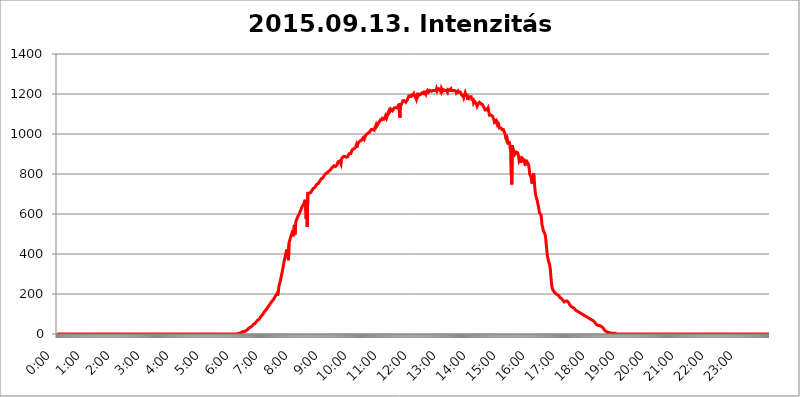
| Category | 2015.09.13. Intenzitás [W/m^2] |
|---|---|
| 0.0 | 0 |
| 0.0006944444444444445 | 0 |
| 0.001388888888888889 | 0 |
| 0.0020833333333333333 | 0 |
| 0.002777777777777778 | 0 |
| 0.003472222222222222 | 0 |
| 0.004166666666666667 | 0 |
| 0.004861111111111111 | 0 |
| 0.005555555555555556 | 0 |
| 0.0062499999999999995 | 0 |
| 0.006944444444444444 | 0 |
| 0.007638888888888889 | 0 |
| 0.008333333333333333 | 0 |
| 0.009027777777777779 | 0 |
| 0.009722222222222222 | 0 |
| 0.010416666666666666 | 0 |
| 0.011111111111111112 | 0 |
| 0.011805555555555555 | 0 |
| 0.012499999999999999 | 0 |
| 0.013194444444444444 | 0 |
| 0.013888888888888888 | 0 |
| 0.014583333333333332 | 0 |
| 0.015277777777777777 | 0 |
| 0.015972222222222224 | 0 |
| 0.016666666666666666 | 0 |
| 0.017361111111111112 | 0 |
| 0.018055555555555557 | 0 |
| 0.01875 | 0 |
| 0.019444444444444445 | 0 |
| 0.02013888888888889 | 0 |
| 0.020833333333333332 | 0 |
| 0.02152777777777778 | 0 |
| 0.022222222222222223 | 0 |
| 0.02291666666666667 | 0 |
| 0.02361111111111111 | 0 |
| 0.024305555555555556 | 0 |
| 0.024999999999999998 | 0 |
| 0.025694444444444447 | 0 |
| 0.02638888888888889 | 0 |
| 0.027083333333333334 | 0 |
| 0.027777777777777776 | 0 |
| 0.02847222222222222 | 0 |
| 0.029166666666666664 | 0 |
| 0.029861111111111113 | 0 |
| 0.030555555555555555 | 0 |
| 0.03125 | 0 |
| 0.03194444444444445 | 0 |
| 0.03263888888888889 | 0 |
| 0.03333333333333333 | 0 |
| 0.034027777777777775 | 0 |
| 0.034722222222222224 | 0 |
| 0.035416666666666666 | 0 |
| 0.036111111111111115 | 0 |
| 0.03680555555555556 | 0 |
| 0.0375 | 0 |
| 0.03819444444444444 | 0 |
| 0.03888888888888889 | 0 |
| 0.03958333333333333 | 0 |
| 0.04027777777777778 | 0 |
| 0.04097222222222222 | 0 |
| 0.041666666666666664 | 0 |
| 0.042361111111111106 | 0 |
| 0.04305555555555556 | 0 |
| 0.043750000000000004 | 0 |
| 0.044444444444444446 | 0 |
| 0.04513888888888889 | 0 |
| 0.04583333333333334 | 0 |
| 0.04652777777777778 | 0 |
| 0.04722222222222222 | 0 |
| 0.04791666666666666 | 0 |
| 0.04861111111111111 | 0 |
| 0.049305555555555554 | 0 |
| 0.049999999999999996 | 0 |
| 0.05069444444444445 | 0 |
| 0.051388888888888894 | 0 |
| 0.052083333333333336 | 0 |
| 0.05277777777777778 | 0 |
| 0.05347222222222222 | 0 |
| 0.05416666666666667 | 0 |
| 0.05486111111111111 | 0 |
| 0.05555555555555555 | 0 |
| 0.05625 | 0 |
| 0.05694444444444444 | 0 |
| 0.057638888888888885 | 0 |
| 0.05833333333333333 | 0 |
| 0.05902777777777778 | 0 |
| 0.059722222222222225 | 0 |
| 0.06041666666666667 | 0 |
| 0.061111111111111116 | 0 |
| 0.06180555555555556 | 0 |
| 0.0625 | 0 |
| 0.06319444444444444 | 0 |
| 0.06388888888888888 | 0 |
| 0.06458333333333334 | 0 |
| 0.06527777777777778 | 0 |
| 0.06597222222222222 | 0 |
| 0.06666666666666667 | 0 |
| 0.06736111111111111 | 0 |
| 0.06805555555555555 | 0 |
| 0.06874999999999999 | 0 |
| 0.06944444444444443 | 0 |
| 0.07013888888888889 | 0 |
| 0.07083333333333333 | 0 |
| 0.07152777777777779 | 0 |
| 0.07222222222222223 | 0 |
| 0.07291666666666667 | 0 |
| 0.07361111111111111 | 0 |
| 0.07430555555555556 | 0 |
| 0.075 | 0 |
| 0.07569444444444444 | 0 |
| 0.0763888888888889 | 0 |
| 0.07708333333333334 | 0 |
| 0.07777777777777778 | 0 |
| 0.07847222222222222 | 0 |
| 0.07916666666666666 | 0 |
| 0.0798611111111111 | 0 |
| 0.08055555555555556 | 0 |
| 0.08125 | 0 |
| 0.08194444444444444 | 0 |
| 0.08263888888888889 | 0 |
| 0.08333333333333333 | 0 |
| 0.08402777777777777 | 0 |
| 0.08472222222222221 | 0 |
| 0.08541666666666665 | 0 |
| 0.08611111111111112 | 0 |
| 0.08680555555555557 | 0 |
| 0.08750000000000001 | 0 |
| 0.08819444444444445 | 0 |
| 0.08888888888888889 | 0 |
| 0.08958333333333333 | 0 |
| 0.09027777777777778 | 0 |
| 0.09097222222222222 | 0 |
| 0.09166666666666667 | 0 |
| 0.09236111111111112 | 0 |
| 0.09305555555555556 | 0 |
| 0.09375 | 0 |
| 0.09444444444444444 | 0 |
| 0.09513888888888888 | 0 |
| 0.09583333333333333 | 0 |
| 0.09652777777777777 | 0 |
| 0.09722222222222222 | 0 |
| 0.09791666666666667 | 0 |
| 0.09861111111111111 | 0 |
| 0.09930555555555555 | 0 |
| 0.09999999999999999 | 0 |
| 0.10069444444444443 | 0 |
| 0.1013888888888889 | 0 |
| 0.10208333333333335 | 0 |
| 0.10277777777777779 | 0 |
| 0.10347222222222223 | 0 |
| 0.10416666666666667 | 0 |
| 0.10486111111111111 | 0 |
| 0.10555555555555556 | 0 |
| 0.10625 | 0 |
| 0.10694444444444444 | 0 |
| 0.1076388888888889 | 0 |
| 0.10833333333333334 | 0 |
| 0.10902777777777778 | 0 |
| 0.10972222222222222 | 0 |
| 0.1111111111111111 | 0 |
| 0.11180555555555556 | 0 |
| 0.11180555555555556 | 0 |
| 0.1125 | 0 |
| 0.11319444444444444 | 0 |
| 0.11388888888888889 | 0 |
| 0.11458333333333333 | 0 |
| 0.11527777777777777 | 0 |
| 0.11597222222222221 | 0 |
| 0.11666666666666665 | 0 |
| 0.1173611111111111 | 0 |
| 0.11805555555555557 | 0 |
| 0.11944444444444445 | 0 |
| 0.12013888888888889 | 0 |
| 0.12083333333333333 | 0 |
| 0.12152777777777778 | 0 |
| 0.12222222222222223 | 0 |
| 0.12291666666666667 | 0 |
| 0.12291666666666667 | 0 |
| 0.12361111111111112 | 0 |
| 0.12430555555555556 | 0 |
| 0.125 | 0 |
| 0.12569444444444444 | 0 |
| 0.12638888888888888 | 0 |
| 0.12708333333333333 | 0 |
| 0.16875 | 0 |
| 0.12847222222222224 | 0 |
| 0.12916666666666668 | 0 |
| 0.12986111111111112 | 0 |
| 0.13055555555555556 | 0 |
| 0.13125 | 0 |
| 0.13194444444444445 | 0 |
| 0.1326388888888889 | 0 |
| 0.13333333333333333 | 0 |
| 0.13402777777777777 | 0 |
| 0.13402777777777777 | 0 |
| 0.13472222222222222 | 0 |
| 0.13541666666666666 | 0 |
| 0.1361111111111111 | 0 |
| 0.13749999999999998 | 0 |
| 0.13819444444444443 | 0 |
| 0.1388888888888889 | 0 |
| 0.13958333333333334 | 0 |
| 0.14027777777777778 | 0 |
| 0.14097222222222222 | 0 |
| 0.14166666666666666 | 0 |
| 0.1423611111111111 | 0 |
| 0.14305555555555557 | 0 |
| 0.14375000000000002 | 0 |
| 0.14444444444444446 | 0 |
| 0.1451388888888889 | 0 |
| 0.1451388888888889 | 0 |
| 0.14652777777777778 | 0 |
| 0.14722222222222223 | 0 |
| 0.14791666666666667 | 0 |
| 0.1486111111111111 | 0 |
| 0.14930555555555555 | 0 |
| 0.15 | 0 |
| 0.15069444444444444 | 0 |
| 0.15138888888888888 | 0 |
| 0.15208333333333332 | 0 |
| 0.15277777777777776 | 0 |
| 0.15347222222222223 | 0 |
| 0.15416666666666667 | 0 |
| 0.15486111111111112 | 0 |
| 0.15555555555555556 | 0 |
| 0.15625 | 0 |
| 0.15694444444444444 | 0 |
| 0.15763888888888888 | 0 |
| 0.15833333333333333 | 0 |
| 0.15902777777777777 | 0 |
| 0.15972222222222224 | 0 |
| 0.16041666666666668 | 0 |
| 0.16111111111111112 | 0 |
| 0.16180555555555556 | 0 |
| 0.1625 | 0 |
| 0.16319444444444445 | 0 |
| 0.1638888888888889 | 0 |
| 0.16458333333333333 | 0 |
| 0.16527777777777777 | 0 |
| 0.16597222222222222 | 0 |
| 0.16666666666666666 | 0 |
| 0.1673611111111111 | 0 |
| 0.16805555555555554 | 0 |
| 0.16874999999999998 | 0 |
| 0.16944444444444443 | 0 |
| 0.17013888888888887 | 0 |
| 0.1708333333333333 | 0 |
| 0.17152777777777775 | 0 |
| 0.17222222222222225 | 0 |
| 0.1729166666666667 | 0 |
| 0.17361111111111113 | 0 |
| 0.17430555555555557 | 0 |
| 0.17500000000000002 | 0 |
| 0.17569444444444446 | 0 |
| 0.1763888888888889 | 0 |
| 0.17708333333333334 | 0 |
| 0.17777777777777778 | 0 |
| 0.17847222222222223 | 0 |
| 0.17916666666666667 | 0 |
| 0.1798611111111111 | 0 |
| 0.18055555555555555 | 0 |
| 0.18125 | 0 |
| 0.18194444444444444 | 0 |
| 0.1826388888888889 | 0 |
| 0.18333333333333335 | 0 |
| 0.1840277777777778 | 0 |
| 0.18472222222222223 | 0 |
| 0.18541666666666667 | 0 |
| 0.18611111111111112 | 0 |
| 0.18680555555555556 | 0 |
| 0.1875 | 0 |
| 0.18819444444444444 | 0 |
| 0.18888888888888888 | 0 |
| 0.18958333333333333 | 0 |
| 0.19027777777777777 | 0 |
| 0.1909722222222222 | 0 |
| 0.19166666666666665 | 0 |
| 0.19236111111111112 | 0 |
| 0.19305555555555554 | 0 |
| 0.19375 | 0 |
| 0.19444444444444445 | 0 |
| 0.1951388888888889 | 0 |
| 0.19583333333333333 | 0 |
| 0.19652777777777777 | 0 |
| 0.19722222222222222 | 0 |
| 0.19791666666666666 | 0 |
| 0.1986111111111111 | 0 |
| 0.19930555555555554 | 0 |
| 0.19999999999999998 | 0 |
| 0.20069444444444443 | 0 |
| 0.20138888888888887 | 0 |
| 0.2020833333333333 | 0 |
| 0.2027777777777778 | 0 |
| 0.2034722222222222 | 0 |
| 0.2041666666666667 | 0 |
| 0.20486111111111113 | 0 |
| 0.20555555555555557 | 0 |
| 0.20625000000000002 | 0 |
| 0.20694444444444446 | 0 |
| 0.2076388888888889 | 0 |
| 0.20833333333333334 | 0 |
| 0.20902777777777778 | 0 |
| 0.20972222222222223 | 0 |
| 0.21041666666666667 | 0 |
| 0.2111111111111111 | 0 |
| 0.21180555555555555 | 0 |
| 0.2125 | 0 |
| 0.21319444444444444 | 0 |
| 0.2138888888888889 | 0 |
| 0.21458333333333335 | 0 |
| 0.2152777777777778 | 0 |
| 0.21597222222222223 | 0 |
| 0.21666666666666667 | 0 |
| 0.21736111111111112 | 0 |
| 0.21805555555555556 | 0 |
| 0.21875 | 0 |
| 0.21944444444444444 | 0 |
| 0.22013888888888888 | 0 |
| 0.22083333333333333 | 0 |
| 0.22152777777777777 | 0 |
| 0.2222222222222222 | 0 |
| 0.22291666666666665 | 0 |
| 0.2236111111111111 | 0 |
| 0.22430555555555556 | 0 |
| 0.225 | 0 |
| 0.22569444444444445 | 0 |
| 0.2263888888888889 | 0 |
| 0.22708333333333333 | 0 |
| 0.22777777777777777 | 0 |
| 0.22847222222222222 | 0 |
| 0.22916666666666666 | 0 |
| 0.2298611111111111 | 0 |
| 0.23055555555555554 | 0 |
| 0.23124999999999998 | 0 |
| 0.23194444444444443 | 0 |
| 0.23263888888888887 | 0 |
| 0.2333333333333333 | 0 |
| 0.2340277777777778 | 0 |
| 0.2347222222222222 | 0 |
| 0.2354166666666667 | 0 |
| 0.23611111111111113 | 0 |
| 0.23680555555555557 | 0 |
| 0.23750000000000002 | 0 |
| 0.23819444444444446 | 0 |
| 0.2388888888888889 | 0 |
| 0.23958333333333334 | 0 |
| 0.24027777777777778 | 0 |
| 0.24097222222222223 | 0 |
| 0.24166666666666667 | 0 |
| 0.2423611111111111 | 0 |
| 0.24305555555555555 | 0 |
| 0.24375 | 0 |
| 0.24444444444444446 | 0 |
| 0.24513888888888888 | 0 |
| 0.24583333333333335 | 0 |
| 0.2465277777777778 | 0 |
| 0.24722222222222223 | 0 |
| 0.24791666666666667 | 0 |
| 0.24861111111111112 | 0 |
| 0.24930555555555556 | 0 |
| 0.25 | 0 |
| 0.25069444444444444 | 0 |
| 0.2513888888888889 | 0 |
| 0.2520833333333333 | 0 |
| 0.25277777777777777 | 3.525 |
| 0.2534722222222222 | 3.525 |
| 0.25416666666666665 | 3.525 |
| 0.2548611111111111 | 3.525 |
| 0.2555555555555556 | 3.525 |
| 0.25625000000000003 | 3.525 |
| 0.2569444444444445 | 3.525 |
| 0.2576388888888889 | 7.887 |
| 0.25833333333333336 | 7.887 |
| 0.2590277777777778 | 7.887 |
| 0.25972222222222224 | 7.887 |
| 0.2604166666666667 | 12.257 |
| 0.2611111111111111 | 12.257 |
| 0.26180555555555557 | 12.257 |
| 0.2625 | 12.257 |
| 0.26319444444444445 | 12.257 |
| 0.2638888888888889 | 16.636 |
| 0.26458333333333334 | 16.636 |
| 0.2652777777777778 | 16.636 |
| 0.2659722222222222 | 21.024 |
| 0.26666666666666666 | 21.024 |
| 0.2673611111111111 | 25.419 |
| 0.26805555555555555 | 25.419 |
| 0.26875 | 29.823 |
| 0.26944444444444443 | 29.823 |
| 0.2701388888888889 | 29.823 |
| 0.2708333333333333 | 34.234 |
| 0.27152777777777776 | 34.234 |
| 0.2722222222222222 | 38.653 |
| 0.27291666666666664 | 38.653 |
| 0.2736111111111111 | 43.079 |
| 0.2743055555555555 | 43.079 |
| 0.27499999999999997 | 47.511 |
| 0.27569444444444446 | 47.511 |
| 0.27638888888888885 | 51.951 |
| 0.27708333333333335 | 51.951 |
| 0.2777777777777778 | 56.398 |
| 0.27847222222222223 | 56.398 |
| 0.2791666666666667 | 60.85 |
| 0.2798611111111111 | 60.85 |
| 0.28055555555555556 | 65.31 |
| 0.28125 | 69.775 |
| 0.28194444444444444 | 74.246 |
| 0.2826388888888889 | 74.246 |
| 0.2833333333333333 | 74.246 |
| 0.28402777777777777 | 78.722 |
| 0.2847222222222222 | 83.205 |
| 0.28541666666666665 | 83.205 |
| 0.28611111111111115 | 87.692 |
| 0.28680555555555554 | 92.184 |
| 0.28750000000000003 | 96.682 |
| 0.2881944444444445 | 96.682 |
| 0.2888888888888889 | 101.184 |
| 0.28958333333333336 | 105.69 |
| 0.2902777777777778 | 110.201 |
| 0.29097222222222224 | 110.201 |
| 0.2916666666666667 | 114.716 |
| 0.2923611111111111 | 119.235 |
| 0.29305555555555557 | 119.235 |
| 0.29375 | 123.758 |
| 0.29444444444444445 | 128.284 |
| 0.2951388888888889 | 132.814 |
| 0.29583333333333334 | 137.347 |
| 0.2965277777777778 | 137.347 |
| 0.2972222222222222 | 141.884 |
| 0.29791666666666666 | 146.423 |
| 0.2986111111111111 | 150.964 |
| 0.29930555555555555 | 155.509 |
| 0.3 | 160.056 |
| 0.30069444444444443 | 160.056 |
| 0.3013888888888889 | 164.605 |
| 0.3020833333333333 | 164.605 |
| 0.30277777777777776 | 169.156 |
| 0.3034722222222222 | 173.709 |
| 0.30416666666666664 | 178.264 |
| 0.3048611111111111 | 182.82 |
| 0.3055555555555555 | 187.378 |
| 0.30624999999999997 | 191.937 |
| 0.3069444444444444 | 191.937 |
| 0.3076388888888889 | 196.497 |
| 0.30833333333333335 | 201.058 |
| 0.3090277777777778 | 191.937 |
| 0.30972222222222223 | 196.497 |
| 0.3104166666666667 | 223.873 |
| 0.3111111111111111 | 242.127 |
| 0.31180555555555556 | 251.251 |
| 0.3125 | 260.373 |
| 0.31319444444444444 | 269.49 |
| 0.3138888888888889 | 283.156 |
| 0.3145833333333333 | 296.808 |
| 0.31527777777777777 | 305.898 |
| 0.3159722222222222 | 319.517 |
| 0.31666666666666665 | 333.113 |
| 0.31736111111111115 | 346.682 |
| 0.31805555555555554 | 360.221 |
| 0.31875000000000003 | 373.729 |
| 0.3194444444444445 | 382.715 |
| 0.3201388888888889 | 396.164 |
| 0.32083333333333336 | 405.108 |
| 0.3215277777777778 | 414.035 |
| 0.32222222222222224 | 422.943 |
| 0.3229166666666667 | 427.39 |
| 0.3236111111111111 | 427.39 |
| 0.32430555555555557 | 369.23 |
| 0.325 | 453.968 |
| 0.32569444444444445 | 462.786 |
| 0.3263888888888889 | 471.582 |
| 0.32708333333333334 | 480.356 |
| 0.3277777777777778 | 489.108 |
| 0.3284722222222222 | 497.836 |
| 0.32916666666666666 | 502.192 |
| 0.3298611111111111 | 510.885 |
| 0.33055555555555555 | 519.555 |
| 0.33125 | 489.108 |
| 0.33194444444444443 | 489.108 |
| 0.3326388888888889 | 545.416 |
| 0.3333333333333333 | 497.836 |
| 0.3340277777777778 | 523.88 |
| 0.3347222222222222 | 562.53 |
| 0.3354166666666667 | 566.793 |
| 0.3361111111111111 | 575.299 |
| 0.3368055555555556 | 579.542 |
| 0.33749999999999997 | 588.009 |
| 0.33819444444444446 | 592.233 |
| 0.33888888888888885 | 596.45 |
| 0.33958333333333335 | 600.661 |
| 0.34027777777777773 | 609.062 |
| 0.34097222222222223 | 613.252 |
| 0.3416666666666666 | 621.613 |
| 0.3423611111111111 | 625.784 |
| 0.3430555555555555 | 634.105 |
| 0.34375 | 638.256 |
| 0.3444444444444445 | 642.4 |
| 0.3451388888888889 | 646.537 |
| 0.3458333333333334 | 650.667 |
| 0.34652777777777777 | 658.909 |
| 0.34722222222222227 | 663.019 |
| 0.34791666666666665 | 671.22 |
| 0.34861111111111115 | 675.311 |
| 0.34930555555555554 | 575.299 |
| 0.35000000000000003 | 658.909 |
| 0.3506944444444444 | 536.82 |
| 0.3513888888888889 | 703.762 |
| 0.3520833333333333 | 699.717 |
| 0.3527777777777778 | 699.717 |
| 0.3534722222222222 | 703.762 |
| 0.3541666666666667 | 703.762 |
| 0.3548611111111111 | 707.8 |
| 0.35555555555555557 | 707.8 |
| 0.35625 | 711.832 |
| 0.35694444444444445 | 715.858 |
| 0.3576388888888889 | 719.877 |
| 0.35833333333333334 | 719.877 |
| 0.3590277777777778 | 727.896 |
| 0.3597222222222222 | 727.896 |
| 0.36041666666666666 | 727.896 |
| 0.3611111111111111 | 731.896 |
| 0.36180555555555555 | 735.89 |
| 0.3625 | 739.877 |
| 0.36319444444444443 | 743.859 |
| 0.3638888888888889 | 747.834 |
| 0.3645833333333333 | 751.803 |
| 0.3652777777777778 | 751.803 |
| 0.3659722222222222 | 751.803 |
| 0.3666666666666667 | 755.766 |
| 0.3673611111111111 | 759.723 |
| 0.3680555555555556 | 763.674 |
| 0.36874999999999997 | 767.62 |
| 0.36944444444444446 | 771.559 |
| 0.37013888888888885 | 775.492 |
| 0.37083333333333335 | 775.492 |
| 0.37152777777777773 | 775.492 |
| 0.37222222222222223 | 779.42 |
| 0.3729166666666666 | 783.342 |
| 0.3736111111111111 | 787.258 |
| 0.3743055555555555 | 791.169 |
| 0.375 | 795.074 |
| 0.3756944444444445 | 798.974 |
| 0.3763888888888889 | 798.974 |
| 0.3770833333333334 | 802.868 |
| 0.37777777777777777 | 802.868 |
| 0.37847222222222227 | 802.868 |
| 0.37916666666666665 | 806.757 |
| 0.37986111111111115 | 810.641 |
| 0.38055555555555554 | 814.519 |
| 0.38125000000000003 | 814.519 |
| 0.3819444444444444 | 814.519 |
| 0.3826388888888889 | 818.392 |
| 0.3833333333333333 | 818.392 |
| 0.3840277777777778 | 826.123 |
| 0.3847222222222222 | 829.981 |
| 0.3854166666666667 | 829.981 |
| 0.3861111111111111 | 833.834 |
| 0.38680555555555557 | 837.682 |
| 0.3875 | 837.682 |
| 0.38819444444444445 | 841.526 |
| 0.3888888888888889 | 845.365 |
| 0.38958333333333334 | 837.682 |
| 0.3902777777777778 | 837.682 |
| 0.3909722222222222 | 837.682 |
| 0.39166666666666666 | 833.834 |
| 0.3923611111111111 | 845.365 |
| 0.39305555555555555 | 849.199 |
| 0.39375 | 860.676 |
| 0.39444444444444443 | 860.676 |
| 0.3951388888888889 | 856.855 |
| 0.3958333333333333 | 864.493 |
| 0.3965277777777778 | 868.305 |
| 0.3972222222222222 | 864.493 |
| 0.3979166666666667 | 849.199 |
| 0.3986111111111111 | 872.114 |
| 0.3993055555555556 | 879.719 |
| 0.39999999999999997 | 883.516 |
| 0.40069444444444446 | 883.516 |
| 0.40138888888888885 | 887.309 |
| 0.40208333333333335 | 887.309 |
| 0.40277777777777773 | 887.309 |
| 0.40347222222222223 | 887.309 |
| 0.4041666666666666 | 887.309 |
| 0.4048611111111111 | 887.309 |
| 0.4055555555555555 | 883.516 |
| 0.40625 | 887.309 |
| 0.4069444444444445 | 887.309 |
| 0.4076388888888889 | 887.309 |
| 0.4083333333333334 | 894.885 |
| 0.40902777777777777 | 894.885 |
| 0.40972222222222227 | 902.447 |
| 0.41041666666666665 | 898.668 |
| 0.41111111111111115 | 902.447 |
| 0.41180555555555554 | 902.447 |
| 0.41250000000000003 | 906.223 |
| 0.4131944444444444 | 917.534 |
| 0.4138888888888889 | 917.534 |
| 0.4145833333333333 | 917.534 |
| 0.4152777777777778 | 925.06 |
| 0.4159722222222222 | 921.298 |
| 0.4166666666666667 | 925.06 |
| 0.4173611111111111 | 928.819 |
| 0.41805555555555557 | 932.576 |
| 0.41875 | 936.33 |
| 0.41944444444444445 | 943.832 |
| 0.4201388888888889 | 932.576 |
| 0.42083333333333334 | 936.33 |
| 0.4215277777777778 | 951.327 |
| 0.4222222222222222 | 951.327 |
| 0.42291666666666666 | 958.814 |
| 0.4236111111111111 | 962.555 |
| 0.42430555555555555 | 962.555 |
| 0.425 | 966.295 |
| 0.42569444444444443 | 970.034 |
| 0.4263888888888889 | 970.034 |
| 0.4270833333333333 | 970.034 |
| 0.4277777777777778 | 966.295 |
| 0.4284722222222222 | 966.295 |
| 0.4291666666666667 | 981.244 |
| 0.4298611111111111 | 981.244 |
| 0.4305555555555556 | 973.772 |
| 0.43124999999999997 | 981.244 |
| 0.43194444444444446 | 988.714 |
| 0.43263888888888885 | 992.448 |
| 0.43333333333333335 | 996.182 |
| 0.43402777777777773 | 999.916 |
| 0.43472222222222223 | 999.916 |
| 0.4354166666666666 | 1003.65 |
| 0.4361111111111111 | 1003.65 |
| 0.4368055555555555 | 1007.383 |
| 0.4375 | 1007.383 |
| 0.4381944444444445 | 1007.383 |
| 0.4388888888888889 | 1014.852 |
| 0.4395833333333334 | 1014.852 |
| 0.44027777777777777 | 1022.323 |
| 0.44097222222222227 | 1022.323 |
| 0.44166666666666665 | 1018.587 |
| 0.44236111111111115 | 1022.323 |
| 0.44305555555555554 | 1026.06 |
| 0.44375000000000003 | 1022.323 |
| 0.4444444444444444 | 1018.587 |
| 0.4451388888888889 | 1029.798 |
| 0.4458333333333333 | 1029.798 |
| 0.4465277777777778 | 1037.277 |
| 0.4472222222222222 | 1044.762 |
| 0.4479166666666667 | 1037.277 |
| 0.4486111111111111 | 1041.019 |
| 0.44930555555555557 | 1044.762 |
| 0.45 | 1052.255 |
| 0.45069444444444445 | 1056.004 |
| 0.4513888888888889 | 1059.756 |
| 0.45208333333333334 | 1063.51 |
| 0.4527777777777778 | 1063.51 |
| 0.4534722222222222 | 1071.027 |
| 0.45416666666666666 | 1067.267 |
| 0.4548611111111111 | 1067.267 |
| 0.45555555555555555 | 1071.027 |
| 0.45625 | 1078.555 |
| 0.45694444444444443 | 1078.555 |
| 0.4576388888888889 | 1074.789 |
| 0.4583333333333333 | 1074.789 |
| 0.4590277777777778 | 1074.789 |
| 0.4597222222222222 | 1082.324 |
| 0.4604166666666667 | 1089.873 |
| 0.4611111111111111 | 1093.653 |
| 0.4618055555555556 | 1078.555 |
| 0.46249999999999997 | 1086.097 |
| 0.46319444444444446 | 1097.437 |
| 0.46388888888888885 | 1105.019 |
| 0.46458333333333335 | 1105.019 |
| 0.46527777777777773 | 1116.426 |
| 0.46597222222222223 | 1108.816 |
| 0.4666666666666666 | 1112.618 |
| 0.4673611111111111 | 1116.426 |
| 0.4680555555555555 | 1124.056 |
| 0.46875 | 1120.238 |
| 0.4694444444444445 | 1120.238 |
| 0.4701388888888889 | 1116.426 |
| 0.4708333333333334 | 1116.426 |
| 0.47152777777777777 | 1124.056 |
| 0.47222222222222227 | 1120.238 |
| 0.47291666666666665 | 1131.708 |
| 0.47361111111111115 | 1127.879 |
| 0.47430555555555554 | 1135.543 |
| 0.47500000000000003 | 1131.708 |
| 0.4756944444444444 | 1131.708 |
| 0.4763888888888889 | 1127.879 |
| 0.4770833333333333 | 1131.708 |
| 0.4777777777777778 | 1135.543 |
| 0.4784722222222222 | 1143.232 |
| 0.4791666666666667 | 1150.946 |
| 0.4798611111111111 | 1147.086 |
| 0.48055555555555557 | 1082.324 |
| 0.48125 | 1154.814 |
| 0.48194444444444445 | 1143.232 |
| 0.4826388888888889 | 1143.232 |
| 0.48333333333333334 | 1147.086 |
| 0.4840277777777778 | 1158.689 |
| 0.4847222222222222 | 1166.46 |
| 0.48541666666666666 | 1162.571 |
| 0.4861111111111111 | 1166.46 |
| 0.48680555555555555 | 1166.46 |
| 0.4875 | 1162.571 |
| 0.48819444444444443 | 1162.571 |
| 0.4888888888888889 | 1158.689 |
| 0.4895833333333333 | 1162.571 |
| 0.4902777777777778 | 1162.571 |
| 0.4909722222222222 | 1170.358 |
| 0.4916666666666667 | 1170.358 |
| 0.4923611111111111 | 1174.263 |
| 0.4930555555555556 | 1189.969 |
| 0.49374999999999997 | 1186.03 |
| 0.49444444444444446 | 1186.03 |
| 0.49513888888888885 | 1189.969 |
| 0.49583333333333335 | 1182.099 |
| 0.49652777777777773 | 1193.918 |
| 0.49722222222222223 | 1197.876 |
| 0.4979166666666666 | 1193.918 |
| 0.4986111111111111 | 1193.918 |
| 0.4993055555555555 | 1193.918 |
| 0.5 | 1201.843 |
| 0.5006944444444444 | 1193.918 |
| 0.5013888888888889 | 1197.876 |
| 0.5020833333333333 | 1186.03 |
| 0.5027777777777778 | 1186.03 |
| 0.5034722222222222 | 1174.263 |
| 0.5041666666666667 | 1189.969 |
| 0.5048611111111111 | 1197.876 |
| 0.5055555555555555 | 1205.82 |
| 0.50625 | 1189.969 |
| 0.5069444444444444 | 1193.918 |
| 0.5076388888888889 | 1197.876 |
| 0.5083333333333333 | 1201.843 |
| 0.5090277777777777 | 1201.843 |
| 0.5097222222222222 | 1197.876 |
| 0.5104166666666666 | 1201.843 |
| 0.5111111111111112 | 1201.843 |
| 0.5118055555555555 | 1205.82 |
| 0.5125000000000001 | 1205.82 |
| 0.5131944444444444 | 1209.807 |
| 0.513888888888889 | 1201.843 |
| 0.5145833333333333 | 1209.807 |
| 0.5152777777777778 | 1205.82 |
| 0.5159722222222222 | 1205.82 |
| 0.5166666666666667 | 1209.807 |
| 0.517361111111111 | 1201.843 |
| 0.5180555555555556 | 1209.807 |
| 0.5187499999999999 | 1213.804 |
| 0.5194444444444445 | 1217.812 |
| 0.5201388888888888 | 1213.804 |
| 0.5208333333333334 | 1209.807 |
| 0.5215277777777778 | 1213.804 |
| 0.5222222222222223 | 1213.804 |
| 0.5229166666666667 | 1217.812 |
| 0.5236111111111111 | 1221.83 |
| 0.5243055555555556 | 1217.812 |
| 0.525 | 1213.804 |
| 0.5256944444444445 | 1217.812 |
| 0.5263888888888889 | 1217.812 |
| 0.5270833333333333 | 1217.812 |
| 0.5277777777777778 | 1221.83 |
| 0.5284722222222222 | 1221.83 |
| 0.5291666666666667 | 1217.812 |
| 0.5298611111111111 | 1221.83 |
| 0.5305555555555556 | 1213.804 |
| 0.53125 | 1217.812 |
| 0.5319444444444444 | 1225.859 |
| 0.5326388888888889 | 1217.812 |
| 0.5333333333333333 | 1225.859 |
| 0.5340277777777778 | 1225.859 |
| 0.5347222222222222 | 1229.899 |
| 0.5354166666666667 | 1225.859 |
| 0.5361111111111111 | 1221.83 |
| 0.5368055555555555 | 1217.812 |
| 0.5375 | 1213.804 |
| 0.5381944444444444 | 1209.807 |
| 0.5388888888888889 | 1225.859 |
| 0.5395833333333333 | 1221.83 |
| 0.5402777777777777 | 1213.804 |
| 0.5409722222222222 | 1213.804 |
| 0.5416666666666666 | 1221.83 |
| 0.5423611111111112 | 1217.812 |
| 0.5430555555555555 | 1225.859 |
| 0.5437500000000001 | 1217.812 |
| 0.5444444444444444 | 1217.812 |
| 0.545138888888889 | 1217.812 |
| 0.5458333333333333 | 1217.812 |
| 0.5465277777777778 | 1213.804 |
| 0.5472222222222222 | 1209.807 |
| 0.5479166666666667 | 1221.83 |
| 0.548611111111111 | 1225.859 |
| 0.5493055555555556 | 1217.812 |
| 0.5499999999999999 | 1217.812 |
| 0.5506944444444445 | 1217.812 |
| 0.5513888888888888 | 1221.83 |
| 0.5520833333333334 | 1225.859 |
| 0.5527777777777778 | 1217.812 |
| 0.5534722222222223 | 1217.812 |
| 0.5541666666666667 | 1217.812 |
| 0.5548611111111111 | 1217.812 |
| 0.5555555555555556 | 1213.804 |
| 0.55625 | 1217.812 |
| 0.5569444444444445 | 1217.812 |
| 0.5576388888888889 | 1221.83 |
| 0.5583333333333333 | 1217.812 |
| 0.5590277777777778 | 1213.804 |
| 0.5597222222222222 | 1205.82 |
| 0.5604166666666667 | 1209.807 |
| 0.5611111111111111 | 1201.843 |
| 0.5618055555555556 | 1213.804 |
| 0.5625 | 1201.843 |
| 0.5631944444444444 | 1209.807 |
| 0.5638888888888889 | 1213.804 |
| 0.5645833333333333 | 1213.804 |
| 0.5652777777777778 | 1209.807 |
| 0.5659722222222222 | 1213.804 |
| 0.5666666666666667 | 1213.804 |
| 0.5673611111111111 | 1193.918 |
| 0.5680555555555555 | 1189.969 |
| 0.56875 | 1193.918 |
| 0.5694444444444444 | 1189.969 |
| 0.5701388888888889 | 1182.099 |
| 0.5708333333333333 | 1189.969 |
| 0.5715277777777777 | 1197.876 |
| 0.5722222222222222 | 1205.82 |
| 0.5729166666666666 | 1197.876 |
| 0.5736111111111112 | 1201.843 |
| 0.5743055555555555 | 1193.918 |
| 0.5750000000000001 | 1193.918 |
| 0.5756944444444444 | 1170.358 |
| 0.576388888888889 | 1178.177 |
| 0.5770833333333333 | 1174.263 |
| 0.5777777777777778 | 1178.177 |
| 0.5784722222222222 | 1186.03 |
| 0.5791666666666667 | 1186.03 |
| 0.579861111111111 | 1189.969 |
| 0.5805555555555556 | 1186.03 |
| 0.5812499999999999 | 1174.263 |
| 0.5819444444444445 | 1178.177 |
| 0.5826388888888888 | 1178.177 |
| 0.5833333333333334 | 1174.263 |
| 0.5840277777777778 | 1154.814 |
| 0.5847222222222223 | 1158.689 |
| 0.5854166666666667 | 1162.571 |
| 0.5861111111111111 | 1158.689 |
| 0.5868055555555556 | 1162.571 |
| 0.5875 | 1154.814 |
| 0.5881944444444445 | 1154.814 |
| 0.5888888888888889 | 1139.384 |
| 0.5895833333333333 | 1143.232 |
| 0.5902777777777778 | 1150.946 |
| 0.5909722222222222 | 1150.946 |
| 0.5916666666666667 | 1150.946 |
| 0.5923611111111111 | 1158.689 |
| 0.5930555555555556 | 1162.571 |
| 0.59375 | 1158.689 |
| 0.5944444444444444 | 1150.946 |
| 0.5951388888888889 | 1150.946 |
| 0.5958333333333333 | 1154.814 |
| 0.5965277777777778 | 1147.086 |
| 0.5972222222222222 | 1143.232 |
| 0.5979166666666667 | 1135.543 |
| 0.5986111111111111 | 1131.708 |
| 0.5993055555555555 | 1127.879 |
| 0.6 | 1120.238 |
| 0.6006944444444444 | 1116.426 |
| 0.6013888888888889 | 1120.238 |
| 0.6020833333333333 | 1120.238 |
| 0.6027777777777777 | 1124.056 |
| 0.6034722222222222 | 1120.238 |
| 0.6041666666666666 | 1131.708 |
| 0.6048611111111112 | 1120.238 |
| 0.6055555555555555 | 1116.426 |
| 0.6062500000000001 | 1093.653 |
| 0.6069444444444444 | 1093.653 |
| 0.607638888888889 | 1093.653 |
| 0.6083333333333333 | 1093.653 |
| 0.6090277777777778 | 1093.653 |
| 0.6097222222222222 | 1097.437 |
| 0.6104166666666667 | 1089.873 |
| 0.611111111111111 | 1089.873 |
| 0.6118055555555556 | 1086.097 |
| 0.6124999999999999 | 1071.027 |
| 0.6131944444444445 | 1059.756 |
| 0.6138888888888888 | 1059.756 |
| 0.6145833333333334 | 1059.756 |
| 0.6152777777777778 | 1067.267 |
| 0.6159722222222223 | 1059.756 |
| 0.6166666666666667 | 1052.255 |
| 0.6173611111111111 | 1059.756 |
| 0.6180555555555556 | 1056.004 |
| 0.61875 | 1052.255 |
| 0.6194444444444445 | 1041.019 |
| 0.6201388888888889 | 1029.798 |
| 0.6208333333333333 | 1033.537 |
| 0.6215277777777778 | 1033.537 |
| 0.6222222222222222 | 1029.798 |
| 0.6229166666666667 | 1026.06 |
| 0.6236111111111111 | 1022.323 |
| 0.6243055555555556 | 1018.587 |
| 0.625 | 1022.323 |
| 0.6256944444444444 | 1022.323 |
| 0.6263888888888889 | 1014.852 |
| 0.6270833333333333 | 1014.852 |
| 0.6277777777777778 | 1003.65 |
| 0.6284722222222222 | 992.448 |
| 0.6291666666666667 | 977.508 |
| 0.6298611111111111 | 977.508 |
| 0.6305555555555555 | 966.295 |
| 0.63125 | 973.772 |
| 0.6319444444444444 | 962.555 |
| 0.6326388888888889 | 947.58 |
| 0.6333333333333333 | 962.555 |
| 0.6340277777777777 | 955.071 |
| 0.6347222222222222 | 947.58 |
| 0.6354166666666666 | 925.06 |
| 0.6361111111111112 | 943.832 |
| 0.6368055555555555 | 802.868 |
| 0.6375000000000001 | 747.834 |
| 0.6381944444444444 | 943.832 |
| 0.638888888888889 | 932.576 |
| 0.6395833333333333 | 928.819 |
| 0.6402777777777778 | 913.766 |
| 0.6409722222222222 | 909.996 |
| 0.6416666666666667 | 898.668 |
| 0.642361111111111 | 894.885 |
| 0.6430555555555556 | 902.447 |
| 0.6437499999999999 | 909.996 |
| 0.6444444444444445 | 906.223 |
| 0.6451388888888888 | 909.996 |
| 0.6458333333333334 | 906.223 |
| 0.6465277777777778 | 894.885 |
| 0.6472222222222223 | 887.309 |
| 0.6479166666666667 | 864.493 |
| 0.6486111111111111 | 868.305 |
| 0.6493055555555556 | 872.114 |
| 0.65 | 856.855 |
| 0.6506944444444445 | 868.305 |
| 0.6513888888888889 | 872.114 |
| 0.6520833333333333 | 879.719 |
| 0.6527777777777778 | 883.516 |
| 0.6534722222222222 | 883.516 |
| 0.6541666666666667 | 872.114 |
| 0.6548611111111111 | 860.676 |
| 0.6555555555555556 | 853.029 |
| 0.65625 | 853.029 |
| 0.6569444444444444 | 860.676 |
| 0.6576388888888889 | 853.029 |
| 0.6583333333333333 | 853.029 |
| 0.6590277777777778 | 860.676 |
| 0.6597222222222222 | 860.676 |
| 0.6604166666666667 | 853.029 |
| 0.6611111111111111 | 845.365 |
| 0.6618055555555555 | 829.981 |
| 0.6625 | 802.868 |
| 0.6631944444444444 | 795.074 |
| 0.6638888888888889 | 791.169 |
| 0.6645833333333333 | 783.342 |
| 0.6652777777777777 | 771.559 |
| 0.6659722222222222 | 751.803 |
| 0.6666666666666666 | 763.674 |
| 0.6673611111111111 | 759.723 |
| 0.6680555555555556 | 802.868 |
| 0.6687500000000001 | 783.342 |
| 0.6694444444444444 | 747.834 |
| 0.6701388888888888 | 719.877 |
| 0.6708333333333334 | 695.666 |
| 0.6715277777777778 | 699.717 |
| 0.6722222222222222 | 691.608 |
| 0.6729166666666666 | 671.22 |
| 0.6736111111111112 | 658.909 |
| 0.6743055555555556 | 646.537 |
| 0.6749999999999999 | 634.105 |
| 0.6756944444444444 | 621.613 |
| 0.6763888888888889 | 604.864 |
| 0.6770833333333334 | 609.062 |
| 0.6777777777777777 | 600.661 |
| 0.6784722222222223 | 596.45 |
| 0.6791666666666667 | 575.299 |
| 0.6798611111111111 | 545.416 |
| 0.6805555555555555 | 536.82 |
| 0.68125 | 532.513 |
| 0.6819444444444445 | 515.223 |
| 0.6826388888888889 | 510.885 |
| 0.6833333333333332 | 506.542 |
| 0.6840277777777778 | 497.836 |
| 0.6847222222222222 | 489.108 |
| 0.6854166666666667 | 462.786 |
| 0.686111111111111 | 436.27 |
| 0.6868055555555556 | 414.035 |
| 0.6875 | 387.202 |
| 0.6881944444444444 | 378.224 |
| 0.688888888888889 | 364.728 |
| 0.6895833333333333 | 360.221 |
| 0.6902777777777778 | 351.198 |
| 0.6909722222222222 | 337.639 |
| 0.6916666666666668 | 319.517 |
| 0.6923611111111111 | 287.709 |
| 0.6930555555555555 | 260.373 |
| 0.69375 | 237.564 |
| 0.6944444444444445 | 228.436 |
| 0.6951388888888889 | 219.309 |
| 0.6958333333333333 | 219.309 |
| 0.6965277777777777 | 214.746 |
| 0.6972222222222223 | 210.182 |
| 0.6979166666666666 | 210.182 |
| 0.6986111111111111 | 205.62 |
| 0.6993055555555556 | 201.058 |
| 0.7000000000000001 | 201.058 |
| 0.7006944444444444 | 201.058 |
| 0.7013888888888888 | 196.497 |
| 0.7020833333333334 | 196.497 |
| 0.7027777777777778 | 191.937 |
| 0.7034722222222222 | 191.937 |
| 0.7041666666666666 | 187.378 |
| 0.7048611111111112 | 182.82 |
| 0.7055555555555556 | 182.82 |
| 0.7062499999999999 | 182.82 |
| 0.7069444444444444 | 178.264 |
| 0.7076388888888889 | 178.264 |
| 0.7083333333333334 | 173.709 |
| 0.7090277777777777 | 169.156 |
| 0.7097222222222223 | 164.605 |
| 0.7104166666666667 | 164.605 |
| 0.7111111111111111 | 160.056 |
| 0.7118055555555555 | 164.605 |
| 0.7125 | 164.605 |
| 0.7131944444444445 | 164.605 |
| 0.7138888888888889 | 164.605 |
| 0.7145833333333332 | 164.605 |
| 0.7152777777777778 | 164.605 |
| 0.7159722222222222 | 160.056 |
| 0.7166666666666667 | 160.056 |
| 0.717361111111111 | 155.509 |
| 0.7180555555555556 | 150.964 |
| 0.71875 | 146.423 |
| 0.7194444444444444 | 141.884 |
| 0.720138888888889 | 141.884 |
| 0.7208333333333333 | 137.347 |
| 0.7215277777777778 | 137.347 |
| 0.7222222222222222 | 137.347 |
| 0.7229166666666668 | 132.814 |
| 0.7236111111111111 | 132.814 |
| 0.7243055555555555 | 128.284 |
| 0.725 | 128.284 |
| 0.7256944444444445 | 128.284 |
| 0.7263888888888889 | 123.758 |
| 0.7270833333333333 | 119.235 |
| 0.7277777777777777 | 119.235 |
| 0.7284722222222223 | 119.235 |
| 0.7291666666666666 | 114.716 |
| 0.7298611111111111 | 114.716 |
| 0.7305555555555556 | 110.201 |
| 0.7312500000000001 | 110.201 |
| 0.7319444444444444 | 110.201 |
| 0.7326388888888888 | 105.69 |
| 0.7333333333333334 | 105.69 |
| 0.7340277777777778 | 105.69 |
| 0.7347222222222222 | 101.184 |
| 0.7354166666666666 | 101.184 |
| 0.7361111111111112 | 101.184 |
| 0.7368055555555556 | 101.184 |
| 0.7374999999999999 | 96.682 |
| 0.7381944444444444 | 96.682 |
| 0.7388888888888889 | 96.682 |
| 0.7395833333333334 | 92.184 |
| 0.7402777777777777 | 92.184 |
| 0.7409722222222223 | 92.184 |
| 0.7416666666666667 | 87.692 |
| 0.7423611111111111 | 87.692 |
| 0.7430555555555555 | 87.692 |
| 0.74375 | 83.205 |
| 0.7444444444444445 | 83.205 |
| 0.7451388888888889 | 83.205 |
| 0.7458333333333332 | 78.722 |
| 0.7465277777777778 | 78.722 |
| 0.7472222222222222 | 74.246 |
| 0.7479166666666667 | 74.246 |
| 0.748611111111111 | 69.775 |
| 0.7493055555555556 | 69.775 |
| 0.75 | 69.775 |
| 0.7506944444444444 | 65.31 |
| 0.751388888888889 | 65.31 |
| 0.7520833333333333 | 65.31 |
| 0.7527777777777778 | 60.85 |
| 0.7534722222222222 | 60.85 |
| 0.7541666666666668 | 56.398 |
| 0.7548611111111111 | 56.398 |
| 0.7555555555555555 | 51.951 |
| 0.75625 | 47.511 |
| 0.7569444444444445 | 43.079 |
| 0.7576388888888889 | 43.079 |
| 0.7583333333333333 | 43.079 |
| 0.7590277777777777 | 43.079 |
| 0.7597222222222223 | 43.079 |
| 0.7604166666666666 | 43.079 |
| 0.7611111111111111 | 38.653 |
| 0.7618055555555556 | 38.653 |
| 0.7625000000000001 | 38.653 |
| 0.7631944444444444 | 38.653 |
| 0.7638888888888888 | 34.234 |
| 0.7645833333333334 | 34.234 |
| 0.7652777777777778 | 29.823 |
| 0.7659722222222222 | 29.823 |
| 0.7666666666666666 | 25.419 |
| 0.7673611111111112 | 21.024 |
| 0.7680555555555556 | 16.636 |
| 0.7687499999999999 | 16.636 |
| 0.7694444444444444 | 12.257 |
| 0.7701388888888889 | 12.257 |
| 0.7708333333333334 | 12.257 |
| 0.7715277777777777 | 12.257 |
| 0.7722222222222223 | 7.887 |
| 0.7729166666666667 | 7.887 |
| 0.7736111111111111 | 7.887 |
| 0.7743055555555555 | 7.887 |
| 0.775 | 7.887 |
| 0.7756944444444445 | 7.887 |
| 0.7763888888888889 | 3.525 |
| 0.7770833333333332 | 3.525 |
| 0.7777777777777778 | 3.525 |
| 0.7784722222222222 | 3.525 |
| 0.7791666666666667 | 3.525 |
| 0.779861111111111 | 3.525 |
| 0.7805555555555556 | 3.525 |
| 0.78125 | 3.525 |
| 0.7819444444444444 | 3.525 |
| 0.782638888888889 | 3.525 |
| 0.7833333333333333 | 0 |
| 0.7840277777777778 | 0 |
| 0.7847222222222222 | 0 |
| 0.7854166666666668 | 0 |
| 0.7861111111111111 | 0 |
| 0.7868055555555555 | 0 |
| 0.7875 | 0 |
| 0.7881944444444445 | 0 |
| 0.7888888888888889 | 0 |
| 0.7895833333333333 | 0 |
| 0.7902777777777777 | 0 |
| 0.7909722222222223 | 0 |
| 0.7916666666666666 | 0 |
| 0.7923611111111111 | 0 |
| 0.7930555555555556 | 0 |
| 0.7937500000000001 | 0 |
| 0.7944444444444444 | 0 |
| 0.7951388888888888 | 0 |
| 0.7958333333333334 | 0 |
| 0.7965277777777778 | 0 |
| 0.7972222222222222 | 0 |
| 0.7979166666666666 | 0 |
| 0.7986111111111112 | 0 |
| 0.7993055555555556 | 0 |
| 0.7999999999999999 | 0 |
| 0.8006944444444444 | 0 |
| 0.8013888888888889 | 0 |
| 0.8020833333333334 | 0 |
| 0.8027777777777777 | 0 |
| 0.8034722222222223 | 0 |
| 0.8041666666666667 | 0 |
| 0.8048611111111111 | 0 |
| 0.8055555555555555 | 0 |
| 0.80625 | 0 |
| 0.8069444444444445 | 0 |
| 0.8076388888888889 | 0 |
| 0.8083333333333332 | 0 |
| 0.8090277777777778 | 0 |
| 0.8097222222222222 | 0 |
| 0.8104166666666667 | 0 |
| 0.811111111111111 | 0 |
| 0.8118055555555556 | 0 |
| 0.8125 | 0 |
| 0.8131944444444444 | 0 |
| 0.813888888888889 | 0 |
| 0.8145833333333333 | 0 |
| 0.8152777777777778 | 0 |
| 0.8159722222222222 | 0 |
| 0.8166666666666668 | 0 |
| 0.8173611111111111 | 0 |
| 0.8180555555555555 | 0 |
| 0.81875 | 0 |
| 0.8194444444444445 | 0 |
| 0.8201388888888889 | 0 |
| 0.8208333333333333 | 0 |
| 0.8215277777777777 | 0 |
| 0.8222222222222223 | 0 |
| 0.8229166666666666 | 0 |
| 0.8236111111111111 | 0 |
| 0.8243055555555556 | 0 |
| 0.8250000000000001 | 0 |
| 0.8256944444444444 | 0 |
| 0.8263888888888888 | 0 |
| 0.8270833333333334 | 0 |
| 0.8277777777777778 | 0 |
| 0.8284722222222222 | 0 |
| 0.8291666666666666 | 0 |
| 0.8298611111111112 | 0 |
| 0.8305555555555556 | 0 |
| 0.8312499999999999 | 0 |
| 0.8319444444444444 | 0 |
| 0.8326388888888889 | 0 |
| 0.8333333333333334 | 0 |
| 0.8340277777777777 | 0 |
| 0.8347222222222223 | 0 |
| 0.8354166666666667 | 0 |
| 0.8361111111111111 | 0 |
| 0.8368055555555555 | 0 |
| 0.8375 | 0 |
| 0.8381944444444445 | 0 |
| 0.8388888888888889 | 0 |
| 0.8395833333333332 | 0 |
| 0.8402777777777778 | 0 |
| 0.8409722222222222 | 0 |
| 0.8416666666666667 | 0 |
| 0.842361111111111 | 0 |
| 0.8430555555555556 | 0 |
| 0.84375 | 0 |
| 0.8444444444444444 | 0 |
| 0.845138888888889 | 0 |
| 0.8458333333333333 | 0 |
| 0.8465277777777778 | 0 |
| 0.8472222222222222 | 0 |
| 0.8479166666666668 | 0 |
| 0.8486111111111111 | 0 |
| 0.8493055555555555 | 0 |
| 0.85 | 0 |
| 0.8506944444444445 | 0 |
| 0.8513888888888889 | 0 |
| 0.8520833333333333 | 0 |
| 0.8527777777777777 | 0 |
| 0.8534722222222223 | 0 |
| 0.8541666666666666 | 0 |
| 0.8548611111111111 | 0 |
| 0.8555555555555556 | 0 |
| 0.8562500000000001 | 0 |
| 0.8569444444444444 | 0 |
| 0.8576388888888888 | 0 |
| 0.8583333333333334 | 0 |
| 0.8590277777777778 | 0 |
| 0.8597222222222222 | 0 |
| 0.8604166666666666 | 0 |
| 0.8611111111111112 | 0 |
| 0.8618055555555556 | 0 |
| 0.8624999999999999 | 0 |
| 0.8631944444444444 | 0 |
| 0.8638888888888889 | 0 |
| 0.8645833333333334 | 0 |
| 0.8652777777777777 | 0 |
| 0.8659722222222223 | 0 |
| 0.8666666666666667 | 0 |
| 0.8673611111111111 | 0 |
| 0.8680555555555555 | 0 |
| 0.86875 | 0 |
| 0.8694444444444445 | 0 |
| 0.8701388888888889 | 0 |
| 0.8708333333333332 | 0 |
| 0.8715277777777778 | 0 |
| 0.8722222222222222 | 0 |
| 0.8729166666666667 | 0 |
| 0.873611111111111 | 0 |
| 0.8743055555555556 | 0 |
| 0.875 | 0 |
| 0.8756944444444444 | 0 |
| 0.876388888888889 | 0 |
| 0.8770833333333333 | 0 |
| 0.8777777777777778 | 0 |
| 0.8784722222222222 | 0 |
| 0.8791666666666668 | 0 |
| 0.8798611111111111 | 0 |
| 0.8805555555555555 | 0 |
| 0.88125 | 0 |
| 0.8819444444444445 | 0 |
| 0.8826388888888889 | 0 |
| 0.8833333333333333 | 0 |
| 0.8840277777777777 | 0 |
| 0.8847222222222223 | 0 |
| 0.8854166666666666 | 0 |
| 0.8861111111111111 | 0 |
| 0.8868055555555556 | 0 |
| 0.8875000000000001 | 0 |
| 0.8881944444444444 | 0 |
| 0.8888888888888888 | 0 |
| 0.8895833333333334 | 0 |
| 0.8902777777777778 | 0 |
| 0.8909722222222222 | 0 |
| 0.8916666666666666 | 0 |
| 0.8923611111111112 | 0 |
| 0.8930555555555556 | 0 |
| 0.8937499999999999 | 0 |
| 0.8944444444444444 | 0 |
| 0.8951388888888889 | 0 |
| 0.8958333333333334 | 0 |
| 0.8965277777777777 | 0 |
| 0.8972222222222223 | 0 |
| 0.8979166666666667 | 0 |
| 0.8986111111111111 | 0 |
| 0.8993055555555555 | 0 |
| 0.9 | 0 |
| 0.9006944444444445 | 0 |
| 0.9013888888888889 | 0 |
| 0.9020833333333332 | 0 |
| 0.9027777777777778 | 0 |
| 0.9034722222222222 | 0 |
| 0.9041666666666667 | 0 |
| 0.904861111111111 | 0 |
| 0.9055555555555556 | 0 |
| 0.90625 | 0 |
| 0.9069444444444444 | 0 |
| 0.907638888888889 | 0 |
| 0.9083333333333333 | 0 |
| 0.9090277777777778 | 0 |
| 0.9097222222222222 | 0 |
| 0.9104166666666668 | 0 |
| 0.9111111111111111 | 0 |
| 0.9118055555555555 | 0 |
| 0.9125 | 0 |
| 0.9131944444444445 | 0 |
| 0.9138888888888889 | 0 |
| 0.9145833333333333 | 0 |
| 0.9152777777777777 | 0 |
| 0.9159722222222223 | 0 |
| 0.9166666666666666 | 0 |
| 0.9173611111111111 | 0 |
| 0.9180555555555556 | 0 |
| 0.9187500000000001 | 0 |
| 0.9194444444444444 | 0 |
| 0.9201388888888888 | 0 |
| 0.9208333333333334 | 0 |
| 0.9215277777777778 | 0 |
| 0.9222222222222222 | 0 |
| 0.9229166666666666 | 0 |
| 0.9236111111111112 | 0 |
| 0.9243055555555556 | 0 |
| 0.9249999999999999 | 0 |
| 0.9256944444444444 | 0 |
| 0.9263888888888889 | 0 |
| 0.9270833333333334 | 0 |
| 0.9277777777777777 | 0 |
| 0.9284722222222223 | 0 |
| 0.9291666666666667 | 0 |
| 0.9298611111111111 | 0 |
| 0.9305555555555555 | 0 |
| 0.93125 | 0 |
| 0.9319444444444445 | 0 |
| 0.9326388888888889 | 0 |
| 0.9333333333333332 | 0 |
| 0.9340277777777778 | 0 |
| 0.9347222222222222 | 0 |
| 0.9354166666666667 | 0 |
| 0.936111111111111 | 0 |
| 0.9368055555555556 | 0 |
| 0.9375 | 0 |
| 0.9381944444444444 | 0 |
| 0.938888888888889 | 0 |
| 0.9395833333333333 | 0 |
| 0.9402777777777778 | 0 |
| 0.9409722222222222 | 0 |
| 0.9416666666666668 | 0 |
| 0.9423611111111111 | 0 |
| 0.9430555555555555 | 0 |
| 0.94375 | 0 |
| 0.9444444444444445 | 0 |
| 0.9451388888888889 | 0 |
| 0.9458333333333333 | 0 |
| 0.9465277777777777 | 0 |
| 0.9472222222222223 | 0 |
| 0.9479166666666666 | 0 |
| 0.9486111111111111 | 0 |
| 0.9493055555555556 | 0 |
| 0.9500000000000001 | 0 |
| 0.9506944444444444 | 0 |
| 0.9513888888888888 | 0 |
| 0.9520833333333334 | 0 |
| 0.9527777777777778 | 0 |
| 0.9534722222222222 | 0 |
| 0.9541666666666666 | 0 |
| 0.9548611111111112 | 0 |
| 0.9555555555555556 | 0 |
| 0.9562499999999999 | 0 |
| 0.9569444444444444 | 0 |
| 0.9576388888888889 | 0 |
| 0.9583333333333334 | 0 |
| 0.9590277777777777 | 0 |
| 0.9597222222222223 | 0 |
| 0.9604166666666667 | 0 |
| 0.9611111111111111 | 0 |
| 0.9618055555555555 | 0 |
| 0.9625 | 0 |
| 0.9631944444444445 | 0 |
| 0.9638888888888889 | 0 |
| 0.9645833333333332 | 0 |
| 0.9652777777777778 | 0 |
| 0.9659722222222222 | 0 |
| 0.9666666666666667 | 0 |
| 0.967361111111111 | 0 |
| 0.9680555555555556 | 0 |
| 0.96875 | 0 |
| 0.9694444444444444 | 0 |
| 0.970138888888889 | 0 |
| 0.9708333333333333 | 0 |
| 0.9715277777777778 | 0 |
| 0.9722222222222222 | 0 |
| 0.9729166666666668 | 0 |
| 0.9736111111111111 | 0 |
| 0.9743055555555555 | 0 |
| 0.975 | 0 |
| 0.9756944444444445 | 0 |
| 0.9763888888888889 | 0 |
| 0.9770833333333333 | 0 |
| 0.9777777777777777 | 0 |
| 0.9784722222222223 | 0 |
| 0.9791666666666666 | 0 |
| 0.9798611111111111 | 0 |
| 0.9805555555555556 | 0 |
| 0.9812500000000001 | 0 |
| 0.9819444444444444 | 0 |
| 0.9826388888888888 | 0 |
| 0.9833333333333334 | 0 |
| 0.9840277777777778 | 0 |
| 0.9847222222222222 | 0 |
| 0.9854166666666666 | 0 |
| 0.9861111111111112 | 0 |
| 0.9868055555555556 | 0 |
| 0.9874999999999999 | 0 |
| 0.9881944444444444 | 0 |
| 0.9888888888888889 | 0 |
| 0.9895833333333334 | 0 |
| 0.9902777777777777 | 0 |
| 0.9909722222222223 | 0 |
| 0.9916666666666667 | 0 |
| 0.9923611111111111 | 0 |
| 0.9930555555555555 | 0 |
| 0.99375 | 0 |
| 0.9944444444444445 | 0 |
| 0.9951388888888889 | 0 |
| 0.9958333333333332 | 0 |
| 0.9965277777777778 | 0 |
| 0.9972222222222222 | 0 |
| 0.9979166666666667 | 0 |
| 0.998611111111111 | 0 |
| 0.9993055555555556 | 0 |